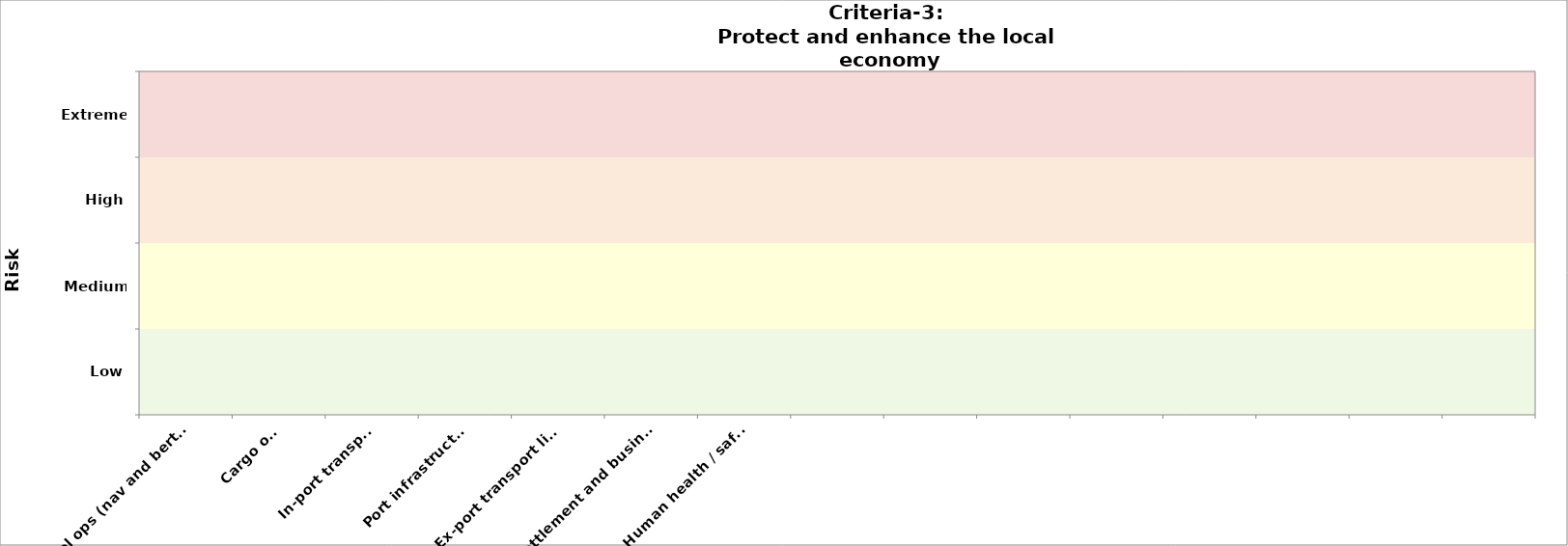
| Category | Criteria-3 (public health) | Criteria-3
2030 |
|---|---|---|
| Vessel ops (nav and berthing) |  | 0 |
| Cargo ops |  | 0 |
| In-port transport |  | 0 |
| Port infrastructure |  | 0 |
| Ex-port transport links |  | 0 |
| Ex-port settlement and businesses |  | 0 |
| Human health / safety  |  | 0 |